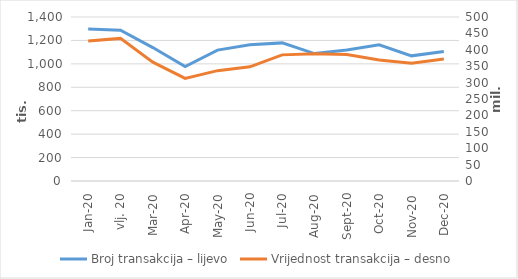
| Category | Broj transakcija – lijevo |
|---|---|
| sij.20 | 1296548 |
| vlj. 20 | 1286499 |
| ožu.20 | 1139062 |
| tra.20 | 977144 |
| svi.20 | 1117472 |
| lip.20 | 1163022 |
| srp.20 | 1179033 |
| kol.20 | 1087611 |
| ruj.20 | 1117498 |
| lis.20 | 1162177 |
| stu.20 | 1068339 |
| pro.20 | 1105250 |